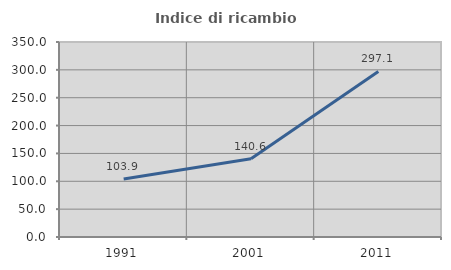
| Category | Indice di ricambio occupazionale  |
|---|---|
| 1991.0 | 103.922 |
| 2001.0 | 140.625 |
| 2011.0 | 297.101 |